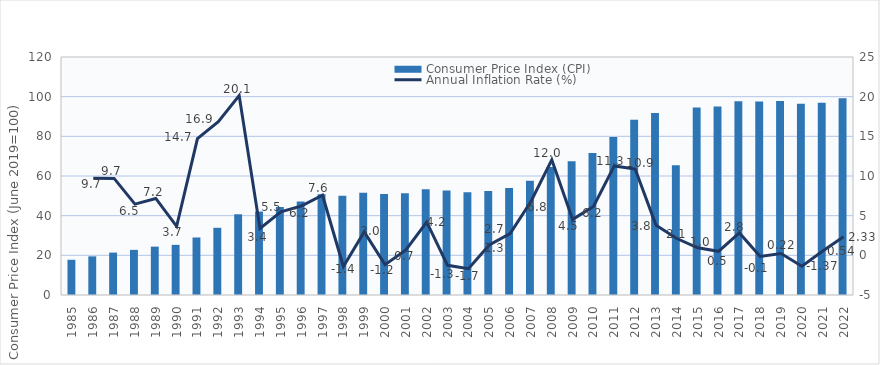
| Category | Consumer Price Index (CPI) |
|---|---|
| 1985.0 | 17.76 |
| 1986.0 | 19.486 |
| 1987.0 | 21.377 |
| 1988.0 | 22.758 |
| 1989.0 | 24.388 |
| 1990.0 | 25.279 |
| 1991.0 | 28.998 |
| 1992.0 | 33.886 |
| 1993.0 | 40.706 |
| 1994.0 | 42.085 |
| 1995.0 | 44.395 |
| 1996.0 | 47.165 |
| 1997.0 | 50.737 |
| 1998.0 | 50.025 |
| 1999.0 | 51.502 |
| 2000.0 | 50.897 |
| 2001.0 | 51.24 |
| 2002.0 | 53.381 |
| 2003.0 | 52.708 |
| 2004.0 | 51.819 |
| 2005.0 | 52.493 |
| 2006.0 | 53.931 |
| 2007.0 | 57.595 |
| 2008.0 | 64.53 |
| 2009.0 | 67.454 |
| 2010.0 | 71.602 |
| 2011.0 | 79.674 |
| 2012.0 | 88.346 |
| 2013.0 | 91.709 |
| 2014.0 | 65.437 |
| 2015.0 | 94.545 |
| 2016.0 | 95.021 |
| 2017.0 | 97.698 |
| 2018.0 | 97.567 |
| 2019.0 | 97.782 |
| 2020.0 | 96.443 |
| 2021.0 | 96.967 |
| 2022.0 | 99.229 |